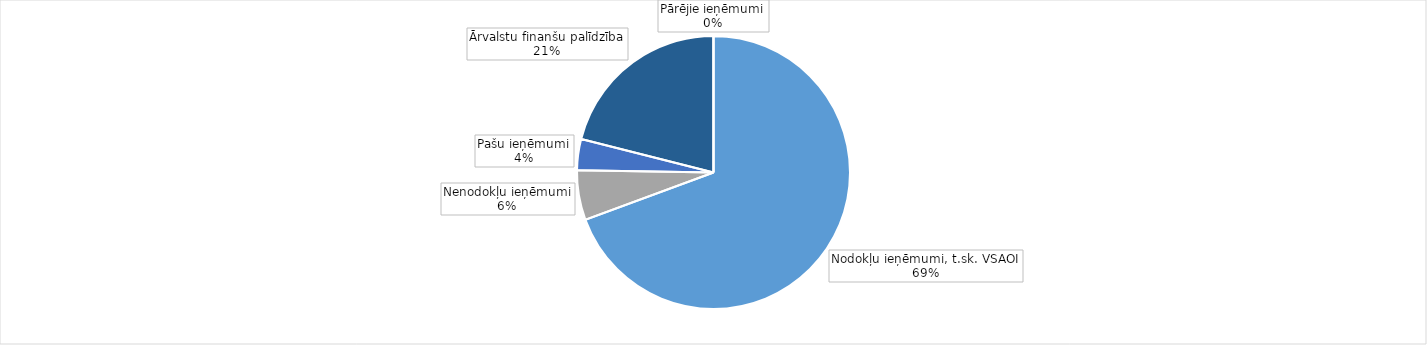
| Category | Series 0 |
|---|---|
| Nodokļu ieņēmumi, t.sk. VSAOI | 1080454.102 |
| Nenodokļu ieņēmumi | 91673.743 |
| Pašu ieņēmumi | 57283.149 |
| Ārvalstu finanšu palīdzība | 327834.744 |
| Pārējie ieņēmumi | 114.064 |